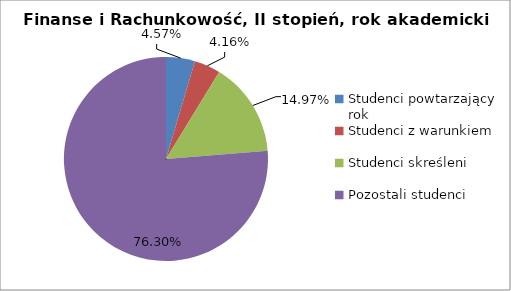
| Category | Series 0 |
|---|---|
| Studenci powtarzający rok | 22 |
| Studenci z warunkiem | 20 |
| Studenci skreśleni | 72 |
| Pozostali studenci | 367 |